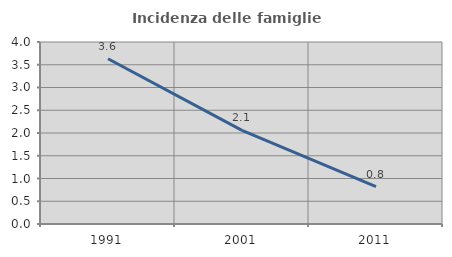
| Category | Incidenza delle famiglie numerose |
|---|---|
| 1991.0 | 3.632 |
| 2001.0 | 2.057 |
| 2011.0 | 0.821 |